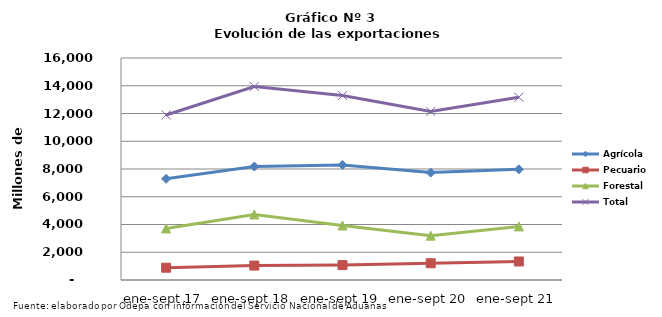
| Category | Agrícola | Pecuario | Forestal | Total |
|---|---|---|---|---|
| ene-sept 17 | 7291030 | 887030 | 3715359 | 11893419 |
| ene-sept 18 | 8182390 | 1039856 | 4724575 | 13946821 |
| ene-sept 19 | 8294138 | 1072438 | 3927427 | 13294003 |
| ene-sept 20 | 7740206 | 1207880 | 3195291 | 12143377 |
| ene-sept 21 | 7975306 | 1335454 | 3862625 | 13173385 |